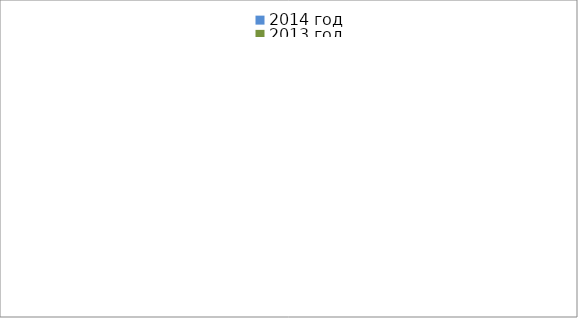
| Category | 2014 год | 2013 год |
|---|---|---|
|  - поджог | 19 | 33 |
|  - неосторожное обращение с огнём | 43 | 50 |
|  - НПТЭ электрооборудования | 17 | 22 |
|  - НПУ и Э печей | 59 | 47 |
|  - НПУ и Э транспортных средств | 54 | 51 |
|   -Шалость с огнем детей | 0 | 3 |
|  -НППБ при эксплуатации эл.приборов | 19 | 26 |
|  - курение | 18 | 11 |
| - прочие | 78 | 71 |
| - не установленные причины | 7 | 1 |